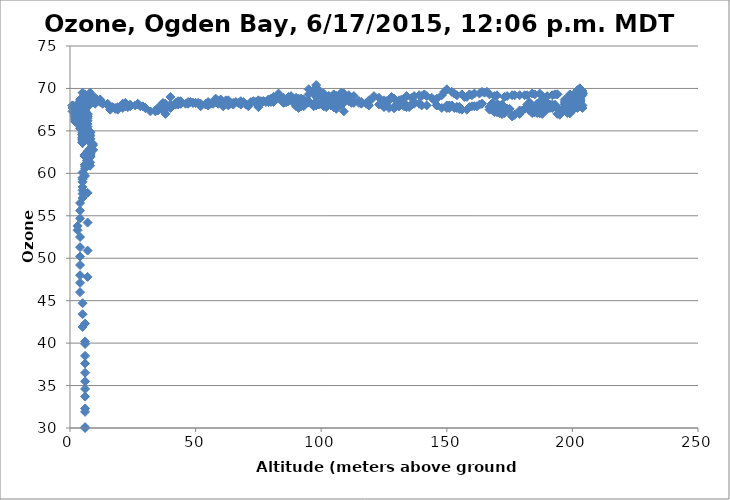
| Category | Series 0 |
|---|---|
| 5.0 | 69.5 |
| 7.0 | 65.5 |
| 7.0 | 61.5 |
| 7.0 | 57.7 |
| 7.0 | 54.2 |
| 7.0 | 50.9 |
| 7.0 | 47.8 |
| -2.0 | 44.9 |
| 6.0 | 42.3 |
| 6.0 | 39.9 |
| 6.0 | 37.6 |
| 6.0 | 35.5 |
| 6.0 | 33.7 |
| 6.0 | 31.9 |
| 6.0 | 30.1 |
| 6.0 | 28.5 |
| 6.0 | 27.1 |
| 6.0 | 25.7 |
| 6.0 | 24.5 |
| 6.0 | 23.4 |
| 6.0 | 22.4 |
| 6.0 | 21.3 |
| 6.0 | 20.5 |
| 6.0 | 19.6 |
| 6.0 | 18.8 |
| 6.0 | 18.1 |
| 6.0 | 17.4 |
| 6.0 | 16.8 |
| 6.0 | 16.2 |
| 6.0 | 15.6 |
| 6.0 | 15.2 |
| 6.0 | 14.7 |
| 6.0 | 14.2 |
| 7.0 | 13.7 |
| 6.0 | 13.3 |
| 6.0 | 12.9 |
| 6.0 | 12.7 |
| 5.0 | 12.1 |
| 5.0 | 12 |
| 5.0 | 11.8 |
| 5.0 | 11.6 |
| 5.0 | 11.5 |
| 5.0 | 11.3 |
| 5.0 | 10.9 |
| 5.0 | 10.6 |
| 6.0 | 10.3 |
| 6.0 | 10 |
| 6.0 | 9.8 |
| 6.0 | 9.6 |
| 6.0 | 9.4 |
| 6.0 | 9.4 |
| 6.0 | 10.8 |
| 6.0 | 13.4 |
| 6.0 | 16.3 |
| 6.0 | 16.3 |
| 6.0 | 19.2 |
| 6.0 | 22.3 |
| 6.0 | 24.9 |
| 6.0 | 27.5 |
| 6.0 | 30 |
| 6.0 | 32.3 |
| 6.0 | 34.6 |
| 6.0 | 36.5 |
| 6.0 | 38.5 |
| 6.0 | 40.2 |
| 5.0 | 41.9 |
| 5.0 | 43.4 |
| 5.0 | 44.7 |
| 4.0 | 46 |
| 4.0 | 47.1 |
| 4.0 | 48 |
| 4.0 | 49.2 |
| 4.0 | 50.2 |
| 4.0 | 51.3 |
| 4.0 | 52.5 |
| 3.0 | 53.3 |
| 3.0 | 53.8 |
| 4.0 | 54.7 |
| 4.0 | 55.6 |
| 4.0 | 56.5 |
| 5.0 | 57.1 |
| 5.0 | 57.6 |
| 5.0 | 58 |
| 5.0 | 58.4 |
| 5.0 | 59 |
| 5.0 | 59.3 |
| 5.0 | 59.5 |
| 6.0 | 59.7 |
| 5.0 | 60.1 |
| 6.0 | 60.6 |
| 6.0 | 60.8 |
| 6.0 | 61 |
| 6.0 | 61 |
| 7.0 | 60.9 |
| 7.0 | 61.2 |
| 7.0 | 61.7 |
| 7.0 | 61.9 |
| 6.0 | 62.1 |
| 6.0 | 62 |
| 6.0 | 62.2 |
| 6.0 | 62.1 |
| 6.0 | 62 |
| 6.0 | 62 |
| 6.0 | 62.1 |
| 6.0 | 62.2 |
| 6.0 | 62.2 |
| 6.0 | 62.2 |
| 6.0 | 62.2 |
| 7.0 | 62.1 |
| 7.0 | 62.3 |
| 7.0 | 62.3 |
| 7.0 | 62.6 |
| 7.0 | 62.4 |
| 7.0 | 62.1 |
| 7.0 | 62 |
| 7.0 | 62.1 |
| 7.0 | 62.1 |
| 7.0 | 62 |
| 7.0 | 62.1 |
| 7.0 | 62.4 |
| 7.0 | 62.2 |
| 7.0 | 61.5 |
| 7.0 | 61.3 |
| 7.0 | 61.4 |
| 7.0 | 61.6 |
| 7.0 | 61.9 |
| 7.0 | 62.1 |
| 8.0 | 62.3 |
| 8.0 | 62 |
| 8.0 | 62 |
| 8.0 | 62.3 |
| 8.0 | 62 |
| 8.0 | 62.1 |
| 8.0 | 62.2 |
| 8.0 | 62.4 |
| 8.0 | 62.2 |
| 8.0 | 61.9 |
| 7.0 | 61.3 |
| 7.0 | 61.5 |
| 7.0 | 61.5 |
| 7.0 | 61.5 |
| 7.0 | 61.2 |
| 8.0 | 61.3 |
| 8.0 | 60.9 |
| 8.0 | 62.4 |
| 8.0 | 62.6 |
| 8.0 | 62.7 |
| 8.0 | 62.7 |
| 8.0 | 62.4 |
| 8.0 | 62.6 |
| 8.0 | 62.4 |
| 8.0 | 62.3 |
| 8.0 | 62.5 |
| 8.0 | 62.9 |
| 8.0 | 62.9 |
| 8.0 | 62.8 |
| 9.0 | 62.7 |
| 9.0 | 62.8 |
| 9.0 | 62.8 |
| 9.0 | 63.3 |
| 9.0 | 63.4 |
| 9.0 | 63.3 |
| 9.0 | 63.5 |
| 8.0 | 63.7 |
| 8.0 | 63.7 |
| 8.0 | 64.1 |
| 8.0 | 64.8 |
| 8.0 | 64.9 |
| 8.0 | 64.8 |
| 7.0 | 64.6 |
| 7.0 | 64.4 |
| 7.0 | 64.5 |
| 7.0 | 64.3 |
| 7.0 | 64.7 |
| 7.0 | 64.7 |
| 6.0 | 64.4 |
| 6.0 | 64.4 |
| 6.0 | 64.6 |
| 6.0 | 64.4 |
| 6.0 | 64.1 |
| 7.0 | 64.4 |
| 7.0 | 64.4 |
| 7.0 | 63.9 |
| 7.0 | 64.2 |
| 7.0 | 64.2 |
| 7.0 | 64.2 |
| 7.0 | 64.6 |
| 7.0 | 64.6 |
| 7.0 | 64.5 |
| 7.0 | 64.4 |
| 7.0 | 64.5 |
| 7.0 | 64.6 |
| 7.0 | 64.6 |
| 7.0 | 64.6 |
| 7.0 | 64.7 |
| 8.0 | 64.8 |
| 8.0 | 64.5 |
| 8.0 | 64.4 |
| 8.0 | 64 |
| 8.0 | 64.1 |
| 8.0 | 64.1 |
| 7.0 | 64.1 |
| 7.0 | 64.2 |
| 7.0 | 64.3 |
| 7.0 | 64.6 |
| 7.0 | 65.2 |
| 7.0 | 65.8 |
| 7.0 | 66.2 |
| 7.0 | 66.5 |
| 7.0 | 66.7 |
| 7.0 | 66.9 |
| 7.0 | 67 |
| 7.0 | 67 |
| 6.0 | 67.6 |
| 6.0 | 67.3 |
| 6.0 | 67.3 |
| 6.0 | 67.7 |
| 6.0 | 67.3 |
| 6.0 | 67.2 |
| 6.0 | 67.4 |
| 6.0 | 67.2 |
| 6.0 | 67.4 |
| 6.0 | 67.5 |
| 6.0 | 67.3 |
| 6.0 | 67.1 |
| 6.0 | 67.2 |
| 6.0 | 67 |
| 6.0 | 66.8 |
| 6.0 | 66.8 |
| 6.0 | 66.4 |
| 6.0 | 66.2 |
| 6.0 | 66.4 |
| 5.0 | 66.7 |
| 5.0 | 66.7 |
| 5.0 | 66.7 |
| 5.0 | 66.6 |
| 5.0 | 66.3 |
| 5.0 | 66.3 |
| 5.0 | 66 |
| 5.0 | 65.7 |
| 5.0 | 65.4 |
| 5.0 | 65 |
| 5.0 | 64.8 |
| 5.0 | 64.6 |
| 5.0 | 64.6 |
| 5.0 | 64.4 |
| 5.0 | 64.2 |
| 5.0 | 64.2 |
| 6.0 | 64.3 |
| 6.0 | 64.4 |
| 5.0 | 64.1 |
| 5.0 | 63.6 |
| 5.0 | 63.6 |
| 5.0 | 63.6 |
| 5.0 | 63.8 |
| 5.0 | 64 |
| 5.0 | 63.6 |
| 5.0 | 63.6 |
| 5.0 | 63.7 |
| 5.0 | 63.9 |
| 5.0 | 64.4 |
| 5.0 | 64.5 |
| 5.0 | 64.6 |
| 5.0 | 65.1 |
| 4.0 | 65.3 |
| 4.0 | 65.5 |
| 4.0 | 65.6 |
| 4.0 | 65.8 |
| 4.0 | 65.8 |
| 4.0 | 66 |
| 4.0 | 66.4 |
| 3.0 | 66.8 |
| 3.0 | 66.9 |
| 3.0 | 66.9 |
| 3.0 | 67.3 |
| 3.0 | 67.7 |
| 2.0 | 67.9 |
| 2.0 | 67.7 |
| 2.0 | 67.1 |
| 2.0 | 66.1 |
| 2.0 | 66.7 |
| 2.0 | 66.8 |
| 2.0 | 67 |
| 2.0 | 67.6 |
| 2.0 | 67.3 |
| 2.0 | 67.3 |
| 2.0 | 67.4 |
| 2.0 | 67.4 |
| 3.0 | 67.3 |
| 3.0 | 67.1 |
| 3.0 | 67.3 |
| 3.0 | 67 |
| 3.0 | 67.7 |
| 3.0 | 67.7 |
| 3.0 | 67.2 |
| 3.0 | 67 |
| 4.0 | 67.5 |
| 4.0 | 67.5 |
| 4.0 | 67 |
| 4.0 | 67.2 |
| 4.0 | 67.9 |
| 4.0 | 68 |
| 4.0 | 68.5 |
| 4.0 | 67.9 |
| 3.0 | 68 |
| 3.0 | 67.9 |
| 4.0 | 68 |
| 4.0 | 68 |
| 4.0 | 67.9 |
| 4.0 | 67.9 |
| 4.0 | 68.7 |
| 6.0 | 69.3 |
| 8.0 | 68.1 |
| 10.0 | 68.2 |
| 11.0 | 68.5 |
| 13.0 | 68.3 |
| 15.0 | 68 |
| 16.0 | 67.5 |
| 18.0 | 67.6 |
| 19.0 | 67.5 |
| 21.0 | 67.7 |
| 22.0 | 67.9 |
| 24.0 | 68.1 |
| 27.0 | 68.1 |
| 28.0 | 67.9 |
| 30.0 | 67.7 |
| 32.0 | 67.3 |
| 34.0 | 67.3 |
| 35.0 | 67.4 |
| 37.0 | 67.4 |
| 38.0 | 67.7 |
| 39.0 | 67.8 |
| 40.0 | 67.7 |
| 42.0 | 68.1 |
| 43.0 | 68.2 |
| 44.0 | 68.2 |
| 46.0 | 68.2 |
| 47.0 | 68.4 |
| 48.0 | 68.4 |
| 49.0 | 68.3 |
| 50.0 | 68.3 |
| 52.0 | 68.2 |
| 54.0 | 68.1 |
| 55.0 | 68 |
| 57.0 | 68.2 |
| 58.0 | 68.4 |
| 59.0 | 68.4 |
| 60.0 | 68.5 |
| 62.0 | 68.6 |
| 63.0 | 68.6 |
| 65.0 | 68.3 |
| 67.0 | 68.3 |
| 68.0 | 68.1 |
| 70.0 | 68.1 |
| 72.0 | 68.4 |
| 73.0 | 68.5 |
| 74.0 | 68.4 |
| 75.0 | 68.6 |
| 76.0 | 68.5 |
| 77.0 | 68.5 |
| 78.0 | 68.4 |
| 79.0 | 68.7 |
| 80.0 | 68.8 |
| 81.0 | 68.8 |
| 83.0 | 68.9 |
| 84.0 | 68.9 |
| 85.0 | 68.9 |
| 87.0 | 69 |
| 89.0 | 68.7 |
| 90.0 | 68.9 |
| 92.0 | 68.8 |
| 93.0 | 68.7 |
| 94.0 | 68.3 |
| 94.0 | 68.4 |
| 95.0 | 69.3 |
| 95.0 | 69.9 |
| 97.0 | 69.7 |
| 98.0 | 69.2 |
| 98.0 | 68.4 |
| 98.0 | 70.4 |
| 98.0 | 70.1 |
| 98.0 | 70.1 |
| 98.0 | 69.9 |
| 98.0 | 69.3 |
| 98.0 | 69 |
| 98.0 | 69.3 |
| 98.0 | 69.8 |
| 99.0 | 69.8 |
| 100.0 | 69 |
| 100.0 | 69.3 |
| 100.0 | 69.4 |
| 100.0 | 69.3 |
| 101.0 | 69.4 |
| 101.0 | 69.2 |
| 101.0 | 69.1 |
| 101.0 | 68.9 |
| 102.0 | 68.5 |
| 102.0 | 68.3 |
| 102.0 | 68.2 |
| 103.0 | 68.4 |
| 103.0 | 68.5 |
| 103.0 | 68.6 |
| 103.0 | 68.7 |
| 103.0 | 69.1 |
| 103.0 | 69.1 |
| 103.0 | 69 |
| 103.0 | 68.8 |
| 104.0 | 68.7 |
| 104.0 | 68.8 |
| 104.0 | 68.8 |
| 104.0 | 68.8 |
| 104.0 | 68.8 |
| 105.0 | 68.7 |
| 105.0 | 68.6 |
| 105.0 | 68.3 |
| 105.0 | 68.3 |
| 105.0 | 68.5 |
| 105.0 | 68.5 |
| 105.0 | 68.5 |
| 105.0 | 69 |
| 105.0 | 69 |
| 105.0 | 68.8 |
| 105.0 | 68.7 |
| 105.0 | 68.9 |
| 104.0 | 68.9 |
| 104.0 | 68.8 |
| 104.0 | 68.7 |
| 104.0 | 68.8 |
| 104.0 | 68.8 |
| 104.0 | 68.7 |
| 104.0 | 69 |
| 103.0 | 68.6 |
| 103.0 | 68.7 |
| 104.0 | 68.6 |
| 104.0 | 68.8 |
| 104.0 | 68.9 |
| 104.0 | 68.7 |
| 104.0 | 68.9 |
| 104.0 | 68.9 |
| 105.0 | 68.7 |
| 105.0 | 68.6 |
| 105.0 | 69 |
| 105.0 | 69.3 |
| 106.0 | 69 |
| 106.0 | 68.5 |
| 105.0 | 68.4 |
| 105.0 | 68.5 |
| 105.0 | 68.5 |
| 105.0 | 68.3 |
| 106.0 | 68.5 |
| 106.0 | 68.9 |
| 106.0 | 69.1 |
| 106.0 | 69.1 |
| 106.0 | 69 |
| 107.0 | 69 |
| 107.0 | 68.9 |
| 107.0 | 68.8 |
| 107.0 | 68.6 |
| 107.0 | 68.7 |
| 106.0 | 68.7 |
| 106.0 | 68.7 |
| 106.0 | 68.7 |
| 105.0 | 68.9 |
| 105.0 | 68.9 |
| 105.0 | 69 |
| 105.0 | 68.9 |
| 106.0 | 68.9 |
| 107.0 | 68.9 |
| 108.0 | 69.5 |
| 109.0 | 69.4 |
| 109.0 | 67.3 |
| 110.0 | 68.7 |
| 111.0 | 69.2 |
| 113.0 | 69.1 |
| 115.0 | 68.3 |
| 116.0 | 68.4 |
| 118.0 | 68.3 |
| 119.0 | 68.6 |
| 120.0 | 68.7 |
| 121.0 | 69.1 |
| 123.0 | 68.9 |
| 125.0 | 68.6 |
| 126.0 | 68.5 |
| 127.0 | 68.6 |
| 128.0 | 69 |
| 129.0 | 68.8 |
| 131.0 | 68.6 |
| 132.0 | 68.7 |
| 133.0 | 68.8 |
| 134.0 | 69.1 |
| 136.0 | 68.9 |
| 137.0 | 69.1 |
| 139.0 | 69.2 |
| 140.0 | 69.1 |
| 141.0 | 69.3 |
| 142.0 | 69.1 |
| 144.0 | 68.9 |
| 145.0 | 68.6 |
| 146.0 | 68.8 |
| 148.0 | 69.2 |
| 149.0 | 69.6 |
| 150.0 | 69.9 |
| 152.0 | 69.6 |
| 153.0 | 69.4 |
| 154.0 | 69.2 |
| 156.0 | 69.3 |
| 157.0 | 69 |
| 158.0 | 69 |
| 159.0 | 69.3 |
| 160.0 | 69.2 |
| 161.0 | 69.4 |
| 163.0 | 69.4 |
| 164.0 | 69.6 |
| 165.0 | 69.5 |
| 166.0 | 69.6 |
| 167.0 | 69.3 |
| 169.0 | 69.1 |
| 170.0 | 69.2 |
| 173.0 | 69 |
| 174.0 | 69.1 |
| 176.0 | 69.2 |
| 177.0 | 69.2 |
| 179.0 | 69.2 |
| 181.0 | 69.2 |
| 182.0 | 69.2 |
| 184.0 | 69.4 |
| 185.0 | 69.3 |
| 187.0 | 69.4 |
| 188.0 | 69.1 |
| 189.0 | 68.9 |
| 190.0 | 69.1 |
| 192.0 | 69.2 |
| 193.0 | 69.3 |
| 194.0 | 69.3 |
| 194.0 | 69.3 |
| 199.0 | 69.3 |
| 201.0 | 69.4 |
| 202.0 | 69.5 |
| 203.0 | 69.3 |
| 203.0 | 68.1 |
| 203.0 | 69.1 |
| 204.0 | 69.2 |
| 204.0 | 69.4 |
| 204.0 | 69.5 |
| 204.0 | 69.7 |
| 204.0 | 69.4 |
| 204.0 | 69.4 |
| 203.0 | 69.5 |
| 203.0 | 69.5 |
| 203.0 | 69.6 |
| 203.0 | 69.8 |
| 203.0 | 69.9 |
| 203.0 | 70 |
| 203.0 | 70 |
| 203.0 | 69.9 |
| 203.0 | 69.9 |
| 203.0 | 70 |
| 203.0 | 70 |
| 203.0 | 69.9 |
| 203.0 | 69.8 |
| 202.0 | 69.5 |
| 202.0 | 69.8 |
| 202.0 | 69.7 |
| 202.0 | 69.6 |
| 202.0 | 69.5 |
| 203.0 | 69 |
| 203.0 | 68.9 |
| 203.0 | 69 |
| 203.0 | 69 |
| 203.0 | 69.2 |
| 203.0 | 69.2 |
| 202.0 | 69 |
| 202.0 | 68.9 |
| 201.0 | 69 |
| 201.0 | 69.2 |
| 201.0 | 69.4 |
| 201.0 | 69.1 |
| 202.0 | 68.8 |
| 202.0 | 69.2 |
| 202.0 | 69.1 |
| 202.0 | 68.9 |
| 202.0 | 69 |
| 202.0 | 68.9 |
| 202.0 | 68.4 |
| 202.0 | 68.5 |
| 202.0 | 68.3 |
| 202.0 | 68.6 |
| 202.0 | 68.7 |
| 203.0 | 68.7 |
| 203.0 | 68.6 |
| 203.0 | 68.6 |
| 203.0 | 69 |
| 203.0 | 68.7 |
| 203.0 | 68.6 |
| 203.0 | 68.4 |
| 203.0 | 68.7 |
| 203.0 | 69.1 |
| 203.0 | 69.1 |
| 203.0 | 68.8 |
| 203.0 | 69.1 |
| 202.0 | 69.5 |
| 202.0 | 69.5 |
| 202.0 | 69.2 |
| 202.0 | 69 |
| 201.0 | 68.8 |
| 201.0 | 68.6 |
| 201.0 | 68.5 |
| 201.0 | 68.6 |
| 201.0 | 68.3 |
| 201.0 | 68.4 |
| 200.0 | 68.6 |
| 200.0 | 68.8 |
| 200.0 | 68.7 |
| 200.0 | 68.7 |
| 199.0 | 68.6 |
| 199.0 | 68.7 |
| 199.0 | 68.4 |
| 199.0 | 68.3 |
| 199.0 | 68.3 |
| 198.0 | 68.4 |
| 198.0 | 68.3 |
| 198.0 | 68.2 |
| 198.0 | 68.5 |
| 198.0 | 68.6 |
| 198.0 | 68.6 |
| 198.0 | 68.6 |
| 197.0 | 68.1 |
| 197.0 | 67.9 |
| 197.0 | 68.1 |
| 197.0 | 68.3 |
| 197.0 | 68.7 |
| 198.0 | 68.7 |
| 197.0 | 68.5 |
| 198.0 | 68.5 |
| 198.0 | 68.4 |
| 198.0 | 68.4 |
| 198.0 | 68.4 |
| 199.0 | 68.5 |
| 200.0 | 68.6 |
| 200.0 | 68 |
| 200.0 | 68.3 |
| 200.0 | 68.5 |
| 201.0 | 68.9 |
| 201.0 | 68.8 |
| 201.0 | 68.8 |
| 201.0 | 68.8 |
| 201.0 | 69.3 |
| 201.0 | 69.3 |
| 201.0 | 69 |
| 201.0 | 68.7 |
| 202.0 | 68.7 |
| 202.0 | 69 |
| 202.0 | 68.8 |
| 202.0 | 68.8 |
| 203.0 | 68.5 |
| 203.0 | 68.5 |
| 203.0 | 68.4 |
| 203.0 | 68.1 |
| 203.0 | 68 |
| 203.0 | 68.1 |
| 203.0 | 68.2 |
| 203.0 | 68.1 |
| 203.0 | 68 |
| 204.0 | 67.7 |
| 204.0 | 68 |
| 203.0 | 67.9 |
| 203.0 | 68 |
| 203.0 | 68.1 |
| 202.0 | 68.2 |
| 202.0 | 67.8 |
| 202.0 | 67.7 |
| 201.0 | 67.9 |
| 200.0 | 67.7 |
| 200.0 | 67.4 |
| 200.0 | 67.5 |
| 199.0 | 67.3 |
| 199.0 | 67.1 |
| 199.0 | 67.1 |
| 198.0 | 67.5 |
| 198.0 | 67.5 |
| 198.0 | 67.4 |
| 198.0 | 67.1 |
| 198.0 | 67.2 |
| 198.0 | 67.5 |
| 198.0 | 67.9 |
| 198.0 | 67.7 |
| 197.0 | 67.5 |
| 197.0 | 67.4 |
| 196.0 | 67.3 |
| 196.0 | 67.2 |
| 195.0 | 67.1 |
| 195.0 | 66.9 |
| 194.0 | 67 |
| 194.0 | 67.7 |
| 193.0 | 67.9 |
| 193.0 | 67.9 |
| 193.0 | 68 |
| 193.0 | 68.1 |
| 192.0 | 68.1 |
| 192.0 | 67.9 |
| 192.0 | 67.8 |
| 192.0 | 67.8 |
| 192.0 | 67.7 |
| 191.0 | 67.7 |
| 191.0 | 67.8 |
| 191.0 | 68.1 |
| 189.0 | 67.9 |
| 187.0 | 68 |
| 186.0 | 68.2 |
| 183.0 | 67.5 |
| 183.0 | 67.8 |
| 182.0 | 67.8 |
| 183.0 | 68.3 |
| 183.0 | 68.3 |
| 182.0 | 68.1 |
| 183.0 | 67.9 |
| 183.0 | 68 |
| 183.0 | 68 |
| 183.0 | 67.6 |
| 184.0 | 67.3 |
| 184.0 | 67.1 |
| 184.0 | 67.3 |
| 185.0 | 67.2 |
| 186.0 | 67.5 |
| 186.0 | 67.7 |
| 186.0 | 67.7 |
| 186.0 | 67.8 |
| 186.0 | 68 |
| 186.0 | 67.9 |
| 186.0 | 67.9 |
| 186.0 | 67.9 |
| 187.0 | 68.1 |
| 187.0 | 68.2 |
| 188.0 | 68.5 |
| 188.0 | 68.5 |
| 188.0 | 68.2 |
| 188.0 | 68.4 |
| 188.0 | 68.4 |
| 188.0 | 68.7 |
| 189.0 | 68.3 |
| 189.0 | 68.3 |
| 190.0 | 68.1 |
| 190.0 | 68.1 |
| 190.0 | 68.2 |
| 190.0 | 68.2 |
| 190.0 | 67.7 |
| 190.0 | 67.6 |
| 190.0 | 67.6 |
| 189.0 | 67.9 |
| 189.0 | 67.8 |
| 189.0 | 67.8 |
| 189.0 | 67.6 |
| 189.0 | 67.5 |
| 189.0 | 67.4 |
| 189.0 | 67.4 |
| 189.0 | 67.6 |
| 189.0 | 67.8 |
| 189.0 | 67.6 |
| 189.0 | 67.4 |
| 189.0 | 67.7 |
| 188.0 | 67.2 |
| 188.0 | 67.6 |
| 188.0 | 67.9 |
| 188.0 | 67.9 |
| 188.0 | 67.9 |
| 188.0 | 67.8 |
| 187.0 | 67.5 |
| 187.0 | 67.5 |
| 187.0 | 67.4 |
| 187.0 | 67.3 |
| 187.0 | 67.5 |
| 187.0 | 67.5 |
| 188.0 | 67.6 |
| 188.0 | 67.4 |
| 188.0 | 67.5 |
| 188.0 | 67.5 |
| 188.0 | 67.7 |
| 188.0 | 67.5 |
| 188.0 | 67.8 |
| 188.0 | 67.6 |
| 187.0 | 67.5 |
| 187.0 | 67.5 |
| 187.0 | 67.6 |
| 187.0 | 67.5 |
| 187.0 | 67.4 |
| 188.0 | 67.6 |
| 188.0 | 67.6 |
| 188.0 | 67.9 |
| 188.0 | 68 |
| 188.0 | 67.5 |
| 188.0 | 67.3 |
| 188.0 | 67 |
| 188.0 | 67.2 |
| 188.0 | 67.3 |
| 187.0 | 67.1 |
| 187.0 | 67.1 |
| 186.0 | 67.1 |
| 186.0 | 67.2 |
| 185.0 | 67.5 |
| 184.0 | 67.7 |
| 183.0 | 67.5 |
| 183.0 | 67.4 |
| 183.0 | 67.4 |
| 181.0 | 67.6 |
| 180.0 | 67.4 |
| 179.0 | 67.4 |
| 179.0 | 67 |
| 177.0 | 66.9 |
| 177.0 | 66.9 |
| 176.0 | 66.8 |
| 176.0 | 66.7 |
| 175.0 | 67.6 |
| 174.0 | 67.6 |
| 174.0 | 67.6 |
| 173.0 | 67.4 |
| 173.0 | 67.1 |
| 172.0 | 67.2 |
| 172.0 | 67 |
| 172.0 | 67 |
| 171.0 | 67.1 |
| 170.0 | 67.2 |
| 170.0 | 67.6 |
| 170.0 | 67.6 |
| 170.0 | 67.7 |
| 170.0 | 67.4 |
| 169.0 | 67.2 |
| 169.0 | 67.3 |
| 169.0 | 67.6 |
| 168.0 | 67.7 |
| 168.0 | 67.9 |
| 168.0 | 67.9 |
| 168.0 | 67.7 |
| 168.0 | 67.7 |
| 168.0 | 68.2 |
| 168.0 | 68.2 |
| 170.0 | 68.2 |
| 170.0 | 67.6 |
| 171.0 | 67.6 |
| 170.0 | 67.6 |
| 170.0 | 67.6 |
| 172.0 | 68 |
| 172.0 | 68.1 |
| 171.0 | 68 |
| 168.0 | 67.5 |
| 167.0 | 67.8 |
| 167.0 | 67.5 |
| 164.0 | 68.2 |
| 164.0 | 68.2 |
| 163.0 | 68.1 |
| 162.0 | 67.9 |
| 161.0 | 67.9 |
| 160.0 | 67.9 |
| 159.0 | 67.8 |
| 158.0 | 67.5 |
| 156.0 | 67.5 |
| 155.0 | 67.6 |
| 155.0 | 67.6 |
| 155.0 | 67.8 |
| 155.0 | 67.7 |
| 155.0 | 67.8 |
| 154.0 | 67.8 |
| 154.0 | 67.7 |
| 154.0 | 67.8 |
| 153.0 | 67.7 |
| 152.0 | 68 |
| 151.0 | 68 |
| 150.0 | 68 |
| 150.0 | 67.7 |
| 151.0 | 67.7 |
| 150.0 | 67.8 |
| 148.0 | 67.7 |
| 146.0 | 68 |
| 146.0 | 68 |
| 142.0 | 68 |
| 140.0 | 68 |
| 139.0 | 68.2 |
| 137.0 | 68.2 |
| 137.0 | 68.4 |
| 136.0 | 68.1 |
| 136.0 | 68.1 |
| 135.0 | 67.8 |
| 134.0 | 67.8 |
| 134.0 | 68 |
| 133.0 | 67.9 |
| 133.0 | 68 |
| 133.0 | 68.2 |
| 131.0 | 68 |
| 131.0 | 67.9 |
| 131.0 | 67.9 |
| 130.0 | 67.9 |
| 130.0 | 68.1 |
| 130.0 | 68.1 |
| 129.0 | 67.7 |
| 129.0 | 67.7 |
| 127.0 | 67.7 |
| 126.0 | 68 |
| 125.0 | 67.8 |
| 125.0 | 67.9 |
| 123.0 | 68.1 |
| 119.0 | 68 |
| 118.0 | 68.2 |
| 116.0 | 68.2 |
| 115.0 | 68.5 |
| 115.0 | 68.5 |
| 113.0 | 68.3 |
| 112.0 | 68.3 |
| 111.0 | 68.5 |
| 109.0 | 68.3 |
| 108.0 | 68.1 |
| 107.0 | 68.1 |
| 106.0 | 68.5 |
| 106.0 | 68.7 |
| 106.0 | 68.4 |
| 106.0 | 68 |
| 106.0 | 68.2 |
| 106.0 | 68.4 |
| 105.0 | 68.2 |
| 104.0 | 68 |
| 104.0 | 68 |
| 104.0 | 68.2 |
| 104.0 | 68.4 |
| 104.0 | 68.2 |
| 105.0 | 68.2 |
| 105.0 | 68.1 |
| 105.0 | 68.2 |
| 105.0 | 67.8 |
| 105.0 | 67.8 |
| 105.0 | 67.8 |
| 106.0 | 67.7 |
| 106.0 | 67.8 |
| 106.0 | 67.8 |
| 106.0 | 67.6 |
| 106.0 | 67.7 |
| 106.0 | 68.3 |
| 105.0 | 68.3 |
| 105.0 | 68.3 |
| 104.0 | 68.4 |
| 104.0 | 68.4 |
| 103.0 | 68.1 |
| 102.0 | 67.8 |
| 101.0 | 67.9 |
| 101.0 | 68 |
| 100.0 | 68.2 |
| 100.0 | 68.2 |
| 100.0 | 68.2 |
| 99.0 | 68.1 |
| 98.0 | 68.3 |
| 98.0 | 68 |
| 97.0 | 67.9 |
| 97.0 | 68.1 |
| 97.0 | 68.2 |
| 95.0 | 68.4 |
| 95.0 | 68.5 |
| 94.0 | 68.3 |
| 94.0 | 68.3 |
| 93.0 | 68.1 |
| 93.0 | 67.9 |
| 92.0 | 67.9 |
| 91.0 | 68.1 |
| 91.0 | 68.1 |
| 91.0 | 68.1 |
| 91.0 | 68.3 |
| 90.0 | 68.3 |
| 90.0 | 68.3 |
| 90.0 | 68.2 |
| 90.0 | 68.2 |
| 90.0 | 68.4 |
| 90.0 | 68 |
| 90.0 | 67.9 |
| 90.0 | 68 |
| 90.0 | 68.2 |
| 90.0 | 68.3 |
| 90.0 | 68.3 |
| 90.0 | 68.3 |
| 91.0 | 68.1 |
| 91.0 | 67.7 |
| 91.0 | 68.2 |
| 91.0 | 68.8 |
| 91.0 | 68.6 |
| 91.0 | 68.6 |
| 91.0 | 67.9 |
| 91.0 | 68.2 |
| 90.0 | 68.7 |
| 90.0 | 68.7 |
| 88.0 | 68.6 |
| 88.0 | 69.1 |
| 88.0 | 69 |
| 87.0 | 68.5 |
| 87.0 | 68.6 |
| 86.0 | 68.4 |
| 86.0 | 68.4 |
| 85.0 | 68.3 |
| 84.0 | 68.9 |
| 83.0 | 68.8 |
| 83.0 | 69.4 |
| 82.0 | 68.8 |
| 81.0 | 69 |
| 81.0 | 68.5 |
| 81.0 | 68.4 |
| 80.0 | 68.4 |
| 79.0 | 68.4 |
| 77.0 | 68.5 |
| 75.0 | 68 |
| 75.0 | 67.8 |
| 71.0 | 67.9 |
| 69.0 | 68.4 |
| 68.0 | 68.5 |
| 66.0 | 68.4 |
| 65.0 | 68.1 |
| 64.0 | 68.2 |
| 64.0 | 68.3 |
| 63.0 | 68.2 |
| 63.0 | 68 |
| 61.0 | 67.9 |
| 60.0 | 68.3 |
| 60.0 | 68.3 |
| 60.0 | 68.3 |
| 60.0 | 68.7 |
| 59.0 | 68.5 |
| 59.0 | 68.2 |
| 59.0 | 68.3 |
| 58.0 | 68.4 |
| 58.0 | 68.8 |
| 57.0 | 68.4 |
| 56.0 | 68.2 |
| 55.0 | 68.4 |
| 54.0 | 68.2 |
| 52.0 | 67.9 |
| 51.0 | 68.3 |
| 50.0 | 68.3 |
| 49.0 | 68.3 |
| 47.0 | 68.2 |
| 44.0 | 68.3 |
| 44.0 | 68.2 |
| 44.0 | 68.5 |
| 43.0 | 68.5 |
| 43.0 | 68.1 |
| 42.0 | 68.3 |
| 40.0 | 68.1 |
| 40.0 | 69 |
| 38.0 | 67 |
| 38.0 | 68.2 |
| 37.0 | 68.3 |
| 37.0 | 68.2 |
| 37.0 | 68.1 |
| 35.0 | 67.7 |
| 34.0 | 67.4 |
| 30.0 | 67.7 |
| 29.0 | 67.9 |
| 27.0 | 68.2 |
| 26.0 | 68 |
| 24.0 | 67.9 |
| 23.0 | 67.8 |
| 22.0 | 68.3 |
| 21.0 | 68.2 |
| 20.0 | 67.9 |
| 19.0 | 67.8 |
| 18.0 | 67.7 |
| 17.0 | 67.8 |
| 16.0 | 67.8 |
| 15.0 | 68.2 |
| 13.0 | 68.2 |
| 12.0 | 68.4 |
| 12.0 | 68.7 |
| 10.0 | 68.9 |
| 9.0 | 69 |
| 8.0 | 69.5 |
| 7.0 | 68.8 |
| 7.0 | 68.6 |
| 8.0 | 68.6 |
| 7.0 | 68.4 |
| 7.0 | 68.3 |
| 7.0 | 68.4 |
| 7.0 | 68.1 |
| 6.0 | 68.3 |
| 6.0 | 68.6 |
| 6.0 | 68.2 |
| 6.0 | 68.2 |
| 6.0 | 68 |
| 6.0 | 67.8 |
| 5.0 | 68 |
| 5.0 | 68.1 |
| 5.0 | 67.4 |
| 5.0 | 67.5 |
| 5.0 | 67.5 |
| 4.0 | 67.6 |
| 4.0 | 68.1 |
| 3.0 | 67.9 |
| 3.0 | 67.9 |
| 2.0 | 67.9 |
| 2.0 | 67.5 |
| 1.0 | 67.7 |
| 1.0 | 68 |
| 1.0 | 68 |
| 1.0 | 67.3 |
| 2.0 | 66.9 |
| 2.0 | 66.6 |
| 2.0 | 66.3 |
| 2.0 | 66.4 |